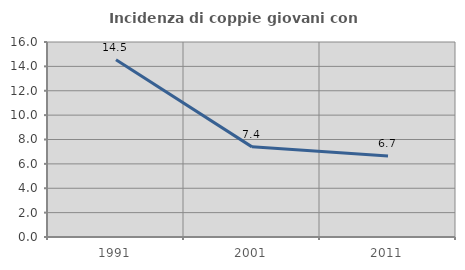
| Category | Incidenza di coppie giovani con figli |
|---|---|
| 1991.0 | 14.544 |
| 2001.0 | 7.395 |
| 2011.0 | 6.654 |